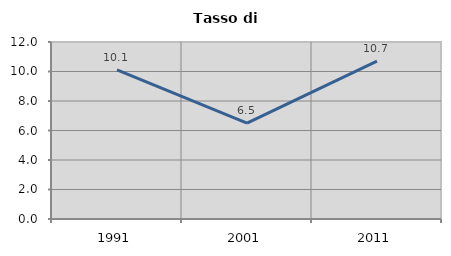
| Category | Tasso di disoccupazione   |
|---|---|
| 1991.0 | 10.104 |
| 2001.0 | 6.506 |
| 2011.0 | 10.706 |